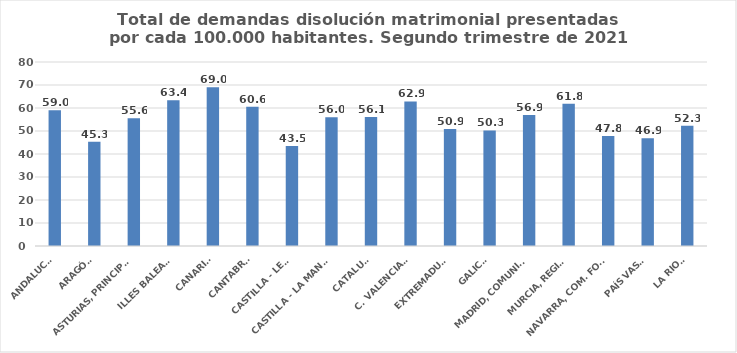
| Category | Series 0 |
|---|---|
| ANDALUCÍA | 59.004 |
| ARAGÓN | 45.346 |
| ASTURIAS, PRINCIPADO | 55.558 |
| ILLES BALEARS | 63.378 |
| CANARIAS | 69.035 |
| CANTABRIA | 60.584 |
| CASTILLA - LEÓN | 43.464 |
| CASTILLA - LA MANCHA | 56.012 |
| CATALUÑA | 56.092 |
| C. VALENCIANA | 62.879 |
| EXTREMADURA | 50.908 |
| GALICIA | 50.255 |
| MADRID, COMUNIDAD | 56.911 |
| MURCIA, REGIÓN | 61.794 |
| NAVARRA, COM. FORAL | 47.805 |
| PAÍS VASCO | 46.869 |
| LA RIOJA | 52.314 |